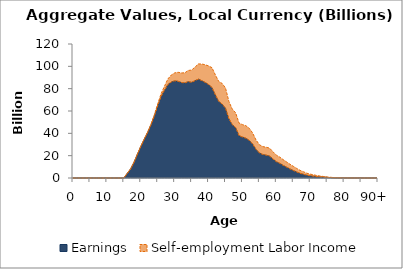
| Category | Earnings | Self-employment Labor Income |
|---|---|---|
| 0 | 0 | 0 |
|  | 0 | 0 |
| 2 | 0 | 0 |
| 3 | 0 | 0 |
| 4 | 0 | 0 |
| 5 | 0 | 0 |
| 6 | 0 | 0 |
| 7 | 0 | 0 |
| 8 | 0 | 0 |
| 9 | 0 | 0 |
| 10 | 0 | 0 |
| 11 | 0 | 0 |
| 12 | 0 | 0 |
| 13 | 0 | 0 |
| 14 | 0 | 0 |
| 15 | 0 | 0 |
| 16 | 4171.715 | 0 |
| 17 | 8115.852 | 0 |
| 18 | 14045.495 | 0 |
| 19 | 21257.979 | 103.195 |
| 20 | 28176.926 | 191.365 |
| 21 | 34608.197 | 307.416 |
| 22 | 40646.615 | 431.625 |
| 23 | 47507.478 | 590.949 |
| 24 | 55563.4 | 991.518 |
| 25 | 64740.005 | 1638.218 |
| 26 | 73053.117 | 2467.701 |
| 27 | 78650.815 | 3563.266 |
| 28 | 83694.429 | 4992.536 |
| 29 | 86016.747 | 6185.222 |
| 30 | 87015.648 | 7084.914 |
| 31 | 86639.402 | 8031.716 |
| 32 | 85510.661 | 8578.678 |
| 33 | 85148.651 | 9043.945 |
| 34 | 86340.528 | 9983.186 |
| 35 | 85701.458 | 10945.819 |
| 36 | 87152.135 | 12133.884 |
| 37 | 88549.403 | 13608.174 |
| 38 | 87205.302 | 14879.528 |
| 39 | 85605.813 | 15812.736 |
| 40 | 83727.166 | 16646.921 |
| 41 | 81105.118 | 17701.263 |
| 42 | 74494.192 | 17890.588 |
| 43 | 68615.09 | 17835.462 |
| 44 | 66283.942 | 18392.959 |
| 45 | 62519.579 | 18133.853 |
| 46 | 53093.265 | 15511.88 |
| 47 | 47806.964 | 13896.112 |
| 48 | 45159.964 | 13187.752 |
| 49 | 37928.209 | 11240.683 |
| 50 | 36666.779 | 11153.572 |
| 51 | 35669.537 | 11185.628 |
| 52 | 33737.296 | 10822.359 |
| 53 | 30507.064 | 9862.072 |
| 54 | 25756.403 | 8338.915 |
| 55 | 22451.787 | 7346.274 |
| 56 | 21075.728 | 7061.416 |
| 57 | 20479.184 | 7066.754 |
| 58 | 19679.587 | 7084.842 |
| 59 | 17056.811 | 6466.986 |
| 60 | 14634.594 | 5839.199 |
| 61 | 13166.459 | 5552.505 |
| 62 | 11395.463 | 5087.847 |
| 63 | 9781.114 | 4667.232 |
| 64 | 8160.36 | 4208.595 |
| 65 | 6752.874 | 3742.25 |
| 66 | 5418.213 | 3178.812 |
| 67 | 4189.693 | 2662.188 |
| 68 | 3337.295 | 2252.455 |
| 69 | 2512.697 | 1768.901 |
| 70 | 1978.392 | 1461.933 |
| 71 | 1610.774 | 1236.636 |
| 72 | 1255.524 | 951.316 |
| 73 | 974.61 | 731.336 |
| 74 | 770.403 | 555.418 |
| 75 | 526.567 | 407.001 |
| 76 | 340.245 | 296.857 |
| 77 | 183.612 | 203.394 |
| 78 | 91.662 | 145.568 |
| 79 | 55.165 | 92.432 |
| 80 | 50.972 | 0 |
| 81 | 51.915 | 0 |
| 82 | 44.131 | 0 |
| 83 | 31.176 | 0 |
| 84 | 17.729 | 0 |
| 85 | 6.865 | 0 |
| 86 | 1.302 | 0 |
| 87 | 0 | 0 |
| 88 | 0 | 0 |
| 89 | 0 | 0 |
| 90+ | 0 | 0 |